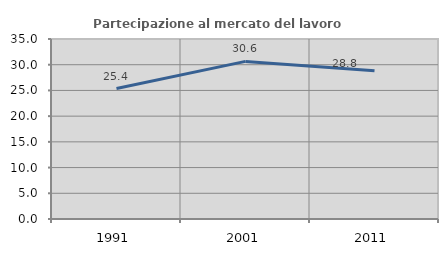
| Category | Partecipazione al mercato del lavoro  femminile |
|---|---|
| 1991.0 | 25.366 |
| 2001.0 | 30.645 |
| 2011.0 | 28.824 |